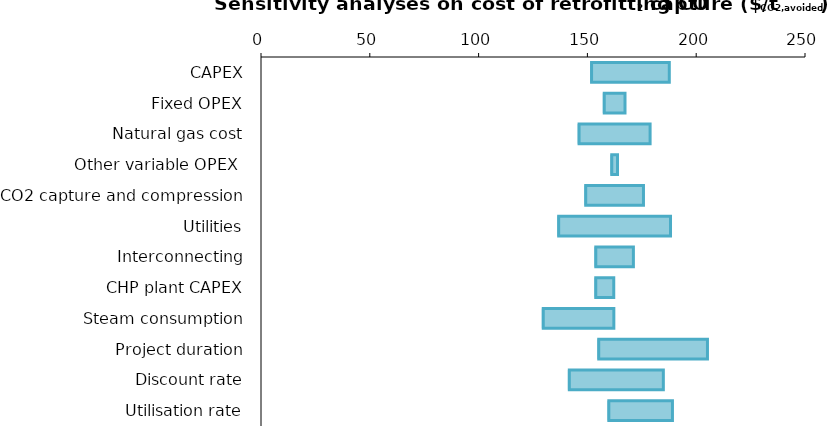
| Category | Minimum value | Increase of the parameter |
|---|---|---|
| CAPEX | 151.227 | 36.409 |
| Fixed OPEX | 157.06 | 10.18 |
| Natural gas cost | 145.487 | 33.325 |
| Other variable OPEX  | 160.482 | 3.336 |
| CO2 capture and compression | 148.534 | 27.231 |
| Utilities | 136.107 | 52.085 |
| Interconnecting | 153.163 | 17.974 |
| CHP plant CAPEX | 153.195 | 8.954 |
| Steam consumption | 129.024 | 33.126 |
| Project duration | 154.517 | 50.658 |
| Discount rate | 141.003 | 43.897 |
| Utilisation rate | 159.157 | 29.926 |